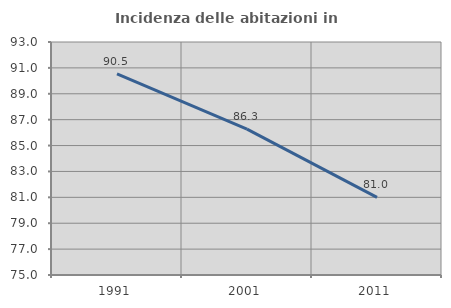
| Category | Incidenza delle abitazioni in proprietà  |
|---|---|
| 1991.0 | 90.53 |
| 2001.0 | 86.268 |
| 2011.0 | 80.997 |